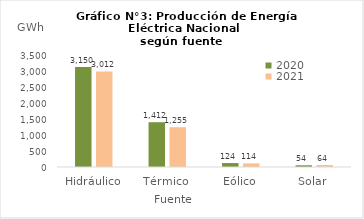
| Category | 2020 | 2021 |
|---|---|---|
| Hidráulico | 3150.111 | 3012.017 |
| Térmico | 1411.798 | 1254.614 |
| Eólico | 124.323 | 114.153 |
| Solar | 54.235 | 63.768 |